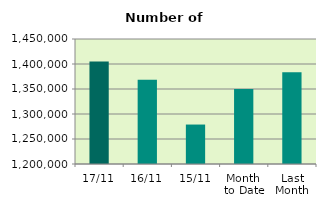
| Category | Series 0 |
|---|---|
| 17/11 | 1404952 |
| 16/11 | 1368314 |
| 15/11 | 1278912 |
| Month 
to Date | 1350103.846 |
| Last
Month | 1383348.571 |